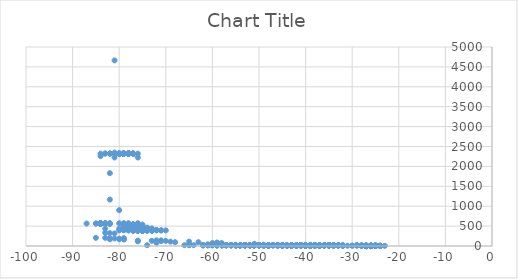
| Category | Series 0 |
|---|---|
| -27.0 | 0 |
| -27.0 | 0 |
| -27.0 | 0 |
| -27.0 | 0 |
| -27.0 | 0 |
| -27.0 | 0 |
| -27.0 | 0 |
| -27.0 | 0 |
| -27.0 | 0 |
| -27.0 | 0 |
| -27.0 | 0 |
| -27.0 | 0 |
| -27.0 | 0 |
| -27.0 | 0 |
| -27.0 | 0 |
| -27.0 | 0 |
| -27.0 | 0 |
| -27.0 | 0 |
| -27.0 | 0 |
| -27.0 | 0 |
| -27.0 | 0 |
| -27.0 | 0 |
| -27.0 | 0 |
| -27.0 | 0 |
| -27.0 | 0 |
| -27.0 | 0 |
| -27.0 | 0 |
| -27.0 | 0 |
| -27.0 | 0 |
| -27.0 | 0 |
| -27.0 | 0 |
| -27.0 | 0 |
| -27.0 | 0 |
| -27.0 | 0 |
| -27.0 | 0 |
| -27.0 | 0 |
| -27.0 | 0 |
| -27.0 | 0 |
| -27.0 | 0 |
| -27.0 | 0 |
| -27.0 | 0 |
| -27.0 | 0 |
| -27.0 | 0 |
| -27.0 | 0 |
| -27.0 | 0 |
| -27.0 | 0 |
| -27.0 | 0 |
| -27.0 | 0 |
| -27.0 | 0 |
| -27.0 | 0 |
| -27.0 | 0 |
| -27.0 | 0 |
| -27.0 | 0 |
| -27.0 | 0 |
| -27.0 | 0 |
| -27.0 | 0 |
| -26.0 | 0 |
| -26.0 | 0 |
| -26.0 | 0 |
| -26.0 | 0 |
| -26.0 | 0 |
| -26.0 | 0 |
| -26.0 | 0 |
| -26.0 | 0 |
| -26.0 | 0 |
| -26.0 | 0 |
| -26.0 | 0 |
| -26.0 | 0 |
| -26.0 | 0 |
| -26.0 | 0 |
| -26.0 | 0 |
| -26.0 | 0 |
| -26.0 | 0 |
| -26.0 | 0 |
| -26.0 | 0 |
| -26.0 | 0 |
| -26.0 | 0 |
| -26.0 | 0 |
| -26.0 | 0 |
| -26.0 | 0 |
| -26.0 | 0 |
| -26.0 | 0 |
| -25.0 | 0 |
| -24.0 | 0 |
| -27.0 | 0.116 |
| -27.0 | 0.116 |
| -27.0 | 0.116 |
| -27.0 | 0.116 |
| -27.0 | 0.116 |
| -27.0 | 0.116 |
| -27.0 | 0.116 |
| -27.0 | 0.116 |
| -27.0 | 0.116 |
| -27.0 | 0.116 |
| -27.0 | 0.116 |
| -27.0 | 0.116 |
| -27.0 | 0.116 |
| -27.0 | 0.116 |
| -27.0 | 0.116 |
| -27.0 | 0.116 |
| -27.0 | 0.116 |
| -27.0 | 0.116 |
| -27.0 | 0.116 |
| -27.0 | 0.116 |
| -27.0 | 0.116 |
| -27.0 | 0.116 |
| -27.0 | 0.116 |
| -27.0 | 0.116 |
| -26.0 | 0.116 |
| -25.0 | 0.116 |
| -25.0 | 0.116 |
| -27.0 | 0.232 |
| -27.0 | 0.232 |
| -27.0 | 0.232 |
| -27.0 | 0.232 |
| -27.0 | 0.232 |
| -27.0 | 0.232 |
| -27.0 | 0.232 |
| -27.0 | 0.232 |
| -27.0 | 0.232 |
| -27.0 | 0.232 |
| -27.0 | 0.232 |
| -27.0 | 0.232 |
| -27.0 | 0.232 |
| -27.0 | 0.232 |
| -26.0 | 0.232 |
| -26.0 | 0.232 |
| -26.0 | 0.232 |
| -26.0 | 0.232 |
| -26.0 | 0.232 |
| -26.0 | 0.232 |
| -27.0 | 0.348 |
| -27.0 | 0.348 |
| -27.0 | 0.348 |
| -27.0 | 0.348 |
| -27.0 | 0.348 |
| -27.0 | 0.348 |
| -27.0 | 0.348 |
| -27.0 | 0.348 |
| -27.0 | 0.348 |
| -27.0 | 0.348 |
| -27.0 | 0.348 |
| -27.0 | 0.348 |
| -27.0 | 0.348 |
| -27.0 | 0.348 |
| -27.0 | 0.348 |
| -27.0 | 0.348 |
| -27.0 | 0.348 |
| -27.0 | 0.348 |
| -27.0 | 0.348 |
| -27.0 | 0.348 |
| -27.0 | 0.348 |
| -27.0 | 0.348 |
| -27.0 | 0.348 |
| -27.0 | 0.348 |
| -27.0 | 0.348 |
| -27.0 | 0.348 |
| -27.0 | 0.348 |
| -27.0 | 0.348 |
| -27.0 | 0.348 |
| -27.0 | 0.348 |
| -27.0 | 0.348 |
| -27.0 | 0.348 |
| -27.0 | 0.348 |
| -27.0 | 0.348 |
| -27.0 | 0.348 |
| -27.0 | 0.348 |
| -27.0 | 0.348 |
| -27.0 | 0.348 |
| -27.0 | 0.348 |
| -27.0 | 0.348 |
| -27.0 | 0.348 |
| -27.0 | 0.348 |
| -27.0 | 0.348 |
| -26.0 | 0.348 |
| -26.0 | 0.348 |
| -26.0 | 0.348 |
| -26.0 | 0.348 |
| -26.0 | 0.348 |
| -26.0 | 0.348 |
| -26.0 | 0.348 |
| -26.0 | 0.348 |
| -26.0 | 0.348 |
| -26.0 | 0.348 |
| -26.0 | 0.348 |
| -25.0 | 0.348 |
| -25.0 | 0.348 |
| -25.0 | 0.348 |
| -25.0 | 0.348 |
| -27.0 | 0.464 |
| -27.0 | 0.464 |
| -27.0 | 0.464 |
| -27.0 | 0.464 |
| -27.0 | 0.464 |
| -27.0 | 0.464 |
| -27.0 | 0.464 |
| -27.0 | 0.464 |
| -27.0 | 0.464 |
| -27.0 | 0.464 |
| -27.0 | 0.464 |
| -27.0 | 0.464 |
| -27.0 | 0.464 |
| -27.0 | 0.464 |
| -27.0 | 0.464 |
| -27.0 | 0.464 |
| -27.0 | 0.464 |
| -27.0 | 0.464 |
| -27.0 | 0.464 |
| -27.0 | 0.464 |
| -27.0 | 0.464 |
| -27.0 | 0.464 |
| -27.0 | 0.464 |
| -27.0 | 0.464 |
| -27.0 | 0.464 |
| -26.0 | 0.464 |
| -26.0 | 0.464 |
| -26.0 | 0.464 |
| -26.0 | 0.464 |
| -26.0 | 0.464 |
| -26.0 | 0.464 |
| -26.0 | 0.464 |
| -26.0 | 0.464 |
| -25.0 | 0.464 |
| -27.0 | 0.967 |
| -27.0 | 0.967 |
| -27.0 | 0.967 |
| -27.0 | 0.967 |
| -27.0 | 0.967 |
| -27.0 | 0.967 |
| -27.0 | 0.967 |
| -27.0 | 0.967 |
| -26.0 | 0.967 |
| -26.0 | 0.967 |
| -26.0 | 0.967 |
| -27.0 | 1.027 |
| -27.0 | 1.027 |
| -27.0 | 1.027 |
| -27.0 | 1.027 |
| -27.0 | 1.027 |
| -27.0 | 1.027 |
| -27.0 | 1.027 |
| -27.0 | 1.027 |
| -27.0 | 1.027 |
| -27.0 | 1.027 |
| -27.0 | 1.027 |
| -27.0 | 1.027 |
| -27.0 | 1.027 |
| -27.0 | 1.027 |
| -27.0 | 1.027 |
| -27.0 | 1.027 |
| -27.0 | 1.027 |
| -27.0 | 1.027 |
| -27.0 | 1.027 |
| -27.0 | 1.027 |
| -27.0 | 1.027 |
| -27.0 | 1.027 |
| -27.0 | 1.027 |
| -27.0 | 1.027 |
| -27.0 | 1.027 |
| -27.0 | 1.027 |
| -27.0 | 1.027 |
| -27.0 | 1.027 |
| -27.0 | 1.027 |
| -27.0 | 1.027 |
| -27.0 | 1.027 |
| -27.0 | 1.027 |
| -27.0 | 1.027 |
| -27.0 | 1.027 |
| -27.0 | 1.027 |
| -27.0 | 1.027 |
| -27.0 | 1.027 |
| -27.0 | 1.027 |
| -27.0 | 1.027 |
| -26.0 | 1.027 |
| -26.0 | 1.027 |
| -26.0 | 1.027 |
| -26.0 | 1.027 |
| -26.0 | 1.027 |
| -26.0 | 1.027 |
| -26.0 | 1.027 |
| -26.0 | 1.027 |
| -26.0 | 1.027 |
| -26.0 | 1.027 |
| -26.0 | 1.027 |
| -26.0 | 1.027 |
| -26.0 | 1.027 |
| -26.0 | 1.027 |
| -26.0 | 1.027 |
| -25.0 | 1.027 |
| -27.0 | 1.097 |
| -27.0 | 1.097 |
| -27.0 | 1.097 |
| -27.0 | 1.097 |
| -27.0 | 1.097 |
| -27.0 | 1.097 |
| -27.0 | 1.097 |
| -27.0 | 1.097 |
| -27.0 | 1.097 |
| -27.0 | 1.097 |
| -27.0 | 1.097 |
| -27.0 | 1.097 |
| -27.0 | 1.097 |
| -27.0 | 1.097 |
| -27.0 | 1.097 |
| -27.0 | 1.097 |
| -27.0 | 1.097 |
| -27.0 | 1.097 |
| -27.0 | 1.097 |
| -26.0 | 1.097 |
| -26.0 | 1.097 |
| -26.0 | 1.097 |
| -26.0 | 1.097 |
| -25.0 | 1.097 |
| -27.0 | 1.174 |
| -27.0 | 1.174 |
| -27.0 | 1.174 |
| -27.0 | 1.174 |
| -27.0 | 1.174 |
| -27.0 | 1.174 |
| -27.0 | 1.174 |
| -27.0 | 1.174 |
| -27.0 | 1.174 |
| -27.0 | 1.174 |
| -27.0 | 1.174 |
| -27.0 | 1.174 |
| -27.0 | 1.174 |
| -27.0 | 1.174 |
| -27.0 | 1.174 |
| -27.0 | 1.174 |
| -27.0 | 1.174 |
| -27.0 | 1.174 |
| -27.0 | 1.174 |
| -27.0 | 1.174 |
| -27.0 | 1.174 |
| -27.0 | 1.174 |
| -27.0 | 1.174 |
| -27.0 | 1.174 |
| -27.0 | 1.174 |
| -26.0 | 1.174 |
| -26.0 | 1.174 |
| -26.0 | 1.174 |
| -26.0 | 1.174 |
| -26.0 | 1.174 |
| -26.0 | 1.174 |
| -26.0 | 1.174 |
| -25.0 | 1.174 |
| -27.0 | 1.257 |
| -27.0 | 1.257 |
| -27.0 | 1.257 |
| -27.0 | 1.257 |
| -27.0 | 1.257 |
| -27.0 | 1.257 |
| -27.0 | 1.257 |
| -27.0 | 1.257 |
| -27.0 | 1.257 |
| -27.0 | 1.257 |
| -27.0 | 1.257 |
| -27.0 | 1.257 |
| -27.0 | 1.257 |
| -27.0 | 1.257 |
| -26.0 | 1.257 |
| -26.0 | 1.257 |
| -26.0 | 1.257 |
| -26.0 | 1.257 |
| -26.0 | 1.257 |
| -26.0 | 1.257 |
| -26.0 | 1.257 |
| -25.0 | 1.257 |
| -27.0 | 1.345 |
| -27.0 | 1.345 |
| -27.0 | 1.345 |
| -27.0 | 1.345 |
| -27.0 | 1.345 |
| -27.0 | 1.345 |
| -27.0 | 1.345 |
| -27.0 | 1.345 |
| -27.0 | 1.345 |
| -27.0 | 1.345 |
| -27.0 | 1.345 |
| -27.0 | 1.345 |
| -27.0 | 1.345 |
| -27.0 | 1.345 |
| -27.0 | 1.345 |
| -27.0 | 1.345 |
| -27.0 | 1.345 |
| -27.0 | 1.345 |
| -27.0 | 1.345 |
| -27.0 | 1.345 |
| -27.0 | 1.345 |
| -27.0 | 1.345 |
| -27.0 | 1.345 |
| -27.0 | 1.345 |
| -27.0 | 1.345 |
| -27.0 | 1.345 |
| -27.0 | 1.345 |
| -27.0 | 1.345 |
| -27.0 | 1.345 |
| -27.0 | 1.345 |
| -27.0 | 1.345 |
| -27.0 | 1.345 |
| -27.0 | 1.345 |
| -27.0 | 1.345 |
| -27.0 | 1.345 |
| -27.0 | 1.345 |
| -27.0 | 1.345 |
| -27.0 | 1.345 |
| -27.0 | 1.345 |
| -27.0 | 1.345 |
| -27.0 | 1.345 |
| -27.0 | 1.345 |
| -27.0 | 1.345 |
| -27.0 | 1.345 |
| -27.0 | 1.345 |
| -27.0 | 1.345 |
| -27.0 | 1.345 |
| -27.0 | 1.345 |
| -27.0 | 1.345 |
| -27.0 | 1.345 |
| -27.0 | 1.345 |
| -27.0 | 1.345 |
| -27.0 | 1.345 |
| -27.0 | 1.345 |
| -27.0 | 1.345 |
| -26.0 | 1.345 |
| -26.0 | 1.345 |
| -26.0 | 1.345 |
| -26.0 | 1.345 |
| -26.0 | 1.345 |
| -26.0 | 1.345 |
| -26.0 | 1.345 |
| -26.0 | 1.345 |
| -26.0 | 1.345 |
| -26.0 | 1.345 |
| -26.0 | 1.345 |
| -26.0 | 1.345 |
| -26.0 | 1.345 |
| -26.0 | 1.345 |
| -26.0 | 1.345 |
| -26.0 | 1.345 |
| -26.0 | 1.345 |
| -26.0 | 1.345 |
| -26.0 | 1.345 |
| -26.0 | 1.345 |
| -26.0 | 1.345 |
| -26.0 | 1.345 |
| -26.0 | 1.345 |
| -26.0 | 1.345 |
| -26.0 | 1.345 |
| -25.0 | 1.345 |
| -25.0 | 1.345 |
| -25.0 | 1.345 |
| -27.0 | 1.437 |
| -27.0 | 1.437 |
| -27.0 | 1.437 |
| -27.0 | 1.437 |
| -27.0 | 1.437 |
| -27.0 | 1.437 |
| -27.0 | 1.437 |
| -27.0 | 1.437 |
| -27.0 | 1.437 |
| -27.0 | 1.437 |
| -27.0 | 1.437 |
| -27.0 | 1.437 |
| -27.0 | 1.437 |
| -27.0 | 1.437 |
| -27.0 | 1.437 |
| -27.0 | 1.437 |
| -27.0 | 1.437 |
| -27.0 | 1.437 |
| -27.0 | 1.437 |
| -27.0 | 1.437 |
| -27.0 | 1.437 |
| -26.0 | 1.437 |
| -26.0 | 1.437 |
| -26.0 | 1.437 |
| -26.0 | 1.437 |
| -26.0 | 1.437 |
| -26.0 | 1.437 |
| -26.0 | 1.437 |
| -26.0 | 1.437 |
| -26.0 | 1.437 |
| -26.0 | 1.437 |
| -26.0 | 1.437 |
| -26.0 | 1.437 |
| -26.0 | 1.437 |
| -25.0 | 1.437 |
| -27.0 | 1.532 |
| -27.0 | 1.532 |
| -27.0 | 2.123 |
| -27.0 | 2.123 |
| -27.0 | 2.123 |
| -27.0 | 2.123 |
| -27.0 | 2.123 |
| -27.0 | 2.123 |
| -27.0 | 2.123 |
| -27.0 | 2.123 |
| -27.0 | 2.123 |
| -27.0 | 2.123 |
| -27.0 | 2.123 |
| -26.0 | 2.123 |
| -26.0 | 2.123 |
| -26.0 | 2.123 |
| -26.0 | 2.123 |
| -26.0 | 2.123 |
| -26.0 | 2.123 |
| -27.0 | 2.194 |
| -27.0 | 2.194 |
| -27.0 | 2.194 |
| -27.0 | 2.194 |
| -27.0 | 2.194 |
| -27.0 | 2.194 |
| -27.0 | 2.194 |
| -27.0 | 2.194 |
| -27.0 | 2.194 |
| -27.0 | 2.194 |
| -27.0 | 2.194 |
| -27.0 | 2.194 |
| -27.0 | 2.194 |
| -27.0 | 2.194 |
| -26.0 | 2.194 |
| -26.0 | 2.194 |
| -25.0 | 2.194 |
| -24.0 | 2.194 |
| -27.0 | 2.269 |
| -27.0 | 2.269 |
| -26.0 | 2.269 |
| -26.0 | 2.269 |
| -26.0 | 2.269 |
| -26.0 | 2.269 |
| -26.0 | 2.269 |
| -26.0 | 2.269 |
| -25.0 | 2.269 |
| -27.0 | 2.348 |
| -27.0 | 2.348 |
| -27.0 | 2.348 |
| -27.0 | 2.348 |
| -27.0 | 2.348 |
| -27.0 | 2.348 |
| -27.0 | 2.348 |
| -27.0 | 2.348 |
| -26.0 | 2.348 |
| -26.0 | 2.348 |
| -26.0 | 2.348 |
| -27.0 | 2.429 |
| -27.0 | 2.429 |
| -27.0 | 2.429 |
| -27.0 | 2.429 |
| -27.0 | 2.429 |
| -27.0 | 2.429 |
| -27.0 | 2.429 |
| -27.0 | 2.429 |
| -26.0 | 2.429 |
| -26.0 | 2.429 |
| -26.0 | 2.429 |
| -27.0 | 2.514 |
| -27.0 | 2.514 |
| -27.0 | 2.514 |
| -27.0 | 2.514 |
| -27.0 | 2.514 |
| -26.0 | 2.514 |
| -26.0 | 2.514 |
| -26.0 | 2.514 |
| -26.0 | 2.514 |
| -25.0 | 2.514 |
| -27.0 | 2.601 |
| -27.0 | 2.601 |
| -27.0 | 2.601 |
| -27.0 | 2.601 |
| -27.0 | 2.601 |
| -27.0 | 2.601 |
| -27.0 | 2.601 |
| -27.0 | 2.601 |
| -26.0 | 2.601 |
| -26.0 | 2.601 |
| -26.0 | 2.601 |
| -27.0 | 2.69 |
| -27.0 | 2.69 |
| -27.0 | 2.69 |
| -27.0 | 2.69 |
| -27.0 | 2.69 |
| -27.0 | 2.69 |
| -27.0 | 2.69 |
| -27.0 | 2.69 |
| -27.0 | 2.69 |
| -26.0 | 2.69 |
| -26.0 | 2.69 |
| -26.0 | 2.69 |
| -25.0 | 2.69 |
| -27.0 | 2.78 |
| -27.0 | 2.78 |
| -27.0 | 2.78 |
| -27.0 | 2.78 |
| -27.0 | 2.78 |
| -27.0 | 2.78 |
| -27.0 | 2.78 |
| -26.0 | 2.78 |
| -26.0 | 2.78 |
| -26.0 | 2.78 |
| -27.0 | 2.873 |
| -27.0 | 2.873 |
| -27.0 | 2.873 |
| -27.0 | 2.873 |
| -27.0 | 2.873 |
| -27.0 | 2.873 |
| -27.0 | 2.873 |
| -27.0 | 2.873 |
| -26.0 | 2.873 |
| -26.0 | 2.873 |
| -25.0 | 2.873 |
| -27.0 | 2.967 |
| -27.0 | 2.967 |
| -27.0 | 2.967 |
| -27.0 | 2.967 |
| -27.0 | 2.967 |
| -27.0 | 2.967 |
| -27.0 | 2.967 |
| -27.0 | 2.967 |
| -27.0 | 2.967 |
| -27.0 | 2.967 |
| -26.0 | 2.967 |
| -26.0 | 2.967 |
| -26.0 | 2.967 |
| -27.0 | 3.063 |
| -27.0 | 3.063 |
| -27.0 | 3.063 |
| -27.0 | 3.063 |
| -27.0 | 3.063 |
| -27.0 | 3.063 |
| -27.0 | 3.063 |
| -27.0 | 3.063 |
| -27.0 | 3.063 |
| -27.0 | 3.063 |
| -27.0 | 3.063 |
| -26.0 | 3.063 |
| -26.0 | 3.063 |
| -26.0 | 3.063 |
| -26.0 | 3.063 |
| -26.0 | 3.063 |
| -27.0 | 3.16 |
| -27.0 | 3.16 |
| -27.0 | 3.16 |
| -27.0 | 3.16 |
| -27.0 | 3.16 |
| -27.0 | 3.16 |
| -27.0 | 3.16 |
| -27.0 | 3.16 |
| -27.0 | 3.16 |
| -26.0 | 3.16 |
| -26.0 | 3.16 |
| -26.0 | 3.16 |
| -26.0 | 3.16 |
| -26.0 | 3.16 |
| -27.0 | 3.259 |
| -27.0 | 3.259 |
| -26.0 | 3.259 |
| -26.0 | 3.259 |
| -27.0 | 3.78 |
| -27.0 | 3.857 |
| -27.0 | 3.857 |
| -27.0 | 3.877 |
| -26.0 | 3.877 |
| -45.0 | 4.03 |
| -37.0 | 4.03 |
| -25.0 | 4.034 |
| -27.0 | 4.125 |
| -27.0 | 4.125 |
| -24.0 | 4.217 |
| -43.0 | 4.257 |
| -27.0 | 4.404 |
| -39.0 | 4.485 |
| -39.0 | 4.485 |
| -27.0 | 4.499 |
| -27.0 | 4.499 |
| -41.0 | 4.504 |
| -38.0 | 4.504 |
| -27.0 | 4.577 |
| -44.0 | 4.599 |
| -37.0 | 4.599 |
| -27.0 | 4.69 |
| -27.0 | 4.69 |
| -27.0 | 4.69 |
| -40.0 | 4.712 |
| -39.0 | 4.712 |
| -42.0 | 4.72 |
| -39.0 | 4.784 |
| -40.0 | 4.788 |
| -26.0 | 4.788 |
| -27.0 | 4.808 |
| -27.0 | 4.808 |
| -27.0 | 4.808 |
| -26.0 | 4.808 |
| -26.0 | 4.808 |
| -26.0 | 4.808 |
| -26.0 | 4.808 |
| -23.0 | 4.808 |
| -39.0 | 4.826 |
| -37.0 | 4.828 |
| -35.0 | 4.828 |
| -27.0 | 4.837 |
| -27.0 | 4.837 |
| -27.0 | 4.837 |
| -27.0 | 4.837 |
| -27.0 | 4.837 |
| -27.0 | 4.837 |
| -27.0 | 4.837 |
| -27.0 | 4.837 |
| -27.0 | 4.837 |
| -27.0 | 4.837 |
| -27.0 | 4.837 |
| -27.0 | 4.837 |
| -27.0 | 4.837 |
| -27.0 | 4.837 |
| -27.0 | 4.837 |
| -27.0 | 4.837 |
| -27.0 | 4.837 |
| -27.0 | 4.837 |
| -27.0 | 4.837 |
| -27.0 | 4.837 |
| -27.0 | 4.837 |
| -27.0 | 4.837 |
| -27.0 | 4.837 |
| -27.0 | 4.837 |
| -27.0 | 4.837 |
| -27.0 | 4.837 |
| -27.0 | 4.837 |
| -27.0 | 4.837 |
| -27.0 | 4.837 |
| -27.0 | 4.837 |
| -27.0 | 4.837 |
| -27.0 | 4.837 |
| -27.0 | 4.837 |
| -27.0 | 4.837 |
| -27.0 | 4.837 |
| -27.0 | 4.837 |
| -27.0 | 4.837 |
| -27.0 | 4.837 |
| -27.0 | 4.837 |
| -27.0 | 4.837 |
| -27.0 | 4.837 |
| -27.0 | 4.837 |
| -27.0 | 4.837 |
| -27.0 | 4.837 |
| -27.0 | 4.837 |
| -27.0 | 4.837 |
| -27.0 | 4.837 |
| -27.0 | 4.837 |
| -27.0 | 4.837 |
| -27.0 | 4.837 |
| -27.0 | 4.837 |
| -27.0 | 4.837 |
| -27.0 | 4.837 |
| -27.0 | 4.837 |
| -27.0 | 4.837 |
| -27.0 | 4.837 |
| -27.0 | 4.837 |
| -27.0 | 4.837 |
| -27.0 | 4.837 |
| -27.0 | 4.837 |
| -27.0 | 4.837 |
| -27.0 | 4.837 |
| -27.0 | 4.837 |
| -27.0 | 4.837 |
| -26.0 | 4.837 |
| -26.0 | 4.837 |
| -26.0 | 4.837 |
| -26.0 | 4.837 |
| -26.0 | 4.837 |
| -26.0 | 4.837 |
| -26.0 | 4.837 |
| -26.0 | 4.837 |
| -26.0 | 4.837 |
| -26.0 | 4.837 |
| -26.0 | 4.837 |
| -26.0 | 4.837 |
| -26.0 | 4.837 |
| -26.0 | 4.837 |
| -26.0 | 4.837 |
| -26.0 | 4.837 |
| -26.0 | 4.837 |
| -26.0 | 4.837 |
| -26.0 | 4.837 |
| -26.0 | 4.837 |
| -26.0 | 4.837 |
| -26.0 | 4.837 |
| -26.0 | 4.837 |
| -26.0 | 4.837 |
| -26.0 | 4.837 |
| -26.0 | 4.837 |
| -26.0 | 4.837 |
| -26.0 | 4.837 |
| -26.0 | 4.837 |
| -26.0 | 4.837 |
| -26.0 | 4.837 |
| -26.0 | 4.837 |
| -26.0 | 4.837 |
| -26.0 | 4.837 |
| -26.0 | 4.837 |
| -26.0 | 4.837 |
| -26.0 | 4.837 |
| -26.0 | 4.837 |
| -26.0 | 4.837 |
| -26.0 | 4.837 |
| -26.0 | 4.837 |
| -26.0 | 4.837 |
| -26.0 | 4.837 |
| -26.0 | 4.837 |
| -26.0 | 4.837 |
| -26.0 | 4.837 |
| -26.0 | 4.837 |
| -26.0 | 4.837 |
| -25.0 | 4.837 |
| -25.0 | 4.837 |
| -39.0 | 4.867 |
| -26.0 | 4.887 |
| -26.0 | 4.887 |
| -25.0 | 4.903 |
| -39.0 | 4.941 |
| -39.0 | 4.941 |
| -27.0 | 4.986 |
| -27.0 | 4.993 |
| -26.0 | 4.993 |
| -38.0 | 5.045 |
| -37.0 | 5.055 |
| -48.0 | 5.055 |
| -40.0 | 5.055 |
| -39.0 | 5.087 |
| -27.0 | 5.087 |
| -26.0 | 5.17 |
| -26.0 | 5.17 |
| -26.0 | 5.203 |
| -32.0 | 5.21 |
| -32.0 | 5.21 |
| -26.0 | 5.284 |
| -27.0 | 5.288 |
| -27.0 | 5.288 |
| -26.0 | 5.288 |
| -26.0 | 5.309 |
| -24.0 | 5.309 |
| -27.0 | 5.331 |
| -27.0 | 5.331 |
| -26.0 | 5.331 |
| -39.0 | 5.39 |
| -38.0 | 5.39 |
| -26.0 | 5.398 |
| -25.0 | 5.398 |
| -27.0 | 5.416 |
| -27.0 | 5.416 |
| -24.0 | 5.563 |
| -25.0 | 5.741 |
| -27.0 | 5.745 |
| -26.0 | 5.745 |
| -27.0 | 5.839 |
| -48.0 | 5.845 |
| -27.0 | 5.857 |
| -27.0 | 5.857 |
| -27.0 | 5.857 |
| -26.0 | 5.857 |
| -27.0 | 5.934 |
| -27.0 | 5.934 |
| -27.0 | 5.934 |
| -26.0 | 5.934 |
| -27.0 | 5.971 |
| -27.0 | 5.971 |
| -26.0 | 5.971 |
| -26.0 | 5.971 |
| -26.0 | 5.971 |
| -26.0 | 5.971 |
| -26.0 | 5.971 |
| -27.0 | 6.029 |
| -27.0 | 6.029 |
| -27.0 | 6.029 |
| -26.0 | 6.029 |
| -26.0 | 6.029 |
| -26.0 | 6.086 |
| -26.0 | 6.086 |
| -26.0 | 6.086 |
| -44.0 | 6.086 |
| -34.0 | 6.086 |
| -27.0 | 6.126 |
| -27.0 | 6.126 |
| -27.0 | 6.126 |
| -27.0 | 6.126 |
| -26.0 | 6.126 |
| -26.0 | 6.126 |
| -26.0 | 6.126 |
| -27.0 | 6.223 |
| -27.0 | 6.223 |
| -26.0 | 6.223 |
| -26.0 | 6.223 |
| -26.0 | 6.223 |
| -26.0 | 6.223 |
| -26.0 | 6.223 |
| -27.0 | 6.261 |
| -27.0 | 6.261 |
| -27.0 | 6.32 |
| -27.0 | 6.32 |
| -27.0 | 6.32 |
| -27.0 | 6.32 |
| -26.0 | 6.32 |
| -26.0 | 6.32 |
| -26.0 | 6.32 |
| -27.0 | 6.34 |
| -26.0 | 6.373 |
| -27.0 | 6.374 |
| -27.0 | 6.417 |
| -27.0 | 6.417 |
| -27.0 | 6.417 |
| -27.0 | 6.417 |
| -27.0 | 6.417 |
| -27.0 | 6.417 |
| -27.0 | 6.417 |
| -27.0 | 6.417 |
| -26.0 | 6.417 |
| -26.0 | 6.417 |
| -26.0 | 6.417 |
| -26.0 | 6.417 |
| -26.0 | 6.417 |
| -26.0 | 6.417 |
| -27.0 | 6.484 |
| -26.0 | 6.484 |
| -26.0 | 6.484 |
| -24.0 | 6.484 |
| -27.0 | 6.511 |
| -27.0 | 6.516 |
| -27.0 | 6.516 |
| -27.0 | 6.516 |
| -27.0 | 6.516 |
| -27.0 | 6.516 |
| -27.0 | 6.516 |
| -27.0 | 6.516 |
| -27.0 | 6.516 |
| -27.0 | 6.516 |
| -27.0 | 6.516 |
| -27.0 | 6.516 |
| -27.0 | 6.516 |
| -26.0 | 6.516 |
| -26.0 | 6.516 |
| -26.0 | 6.516 |
| -26.0 | 6.516 |
| -26.0 | 6.516 |
| -26.0 | 6.516 |
| -26.0 | 6.516 |
| -25.0 | 6.516 |
| -27.0 | 6.596 |
| -26.0 | 6.596 |
| -27.0 | 6.616 |
| -27.0 | 6.616 |
| -27.0 | 6.616 |
| -27.0 | 6.616 |
| -27.0 | 6.616 |
| -27.0 | 6.616 |
| -27.0 | 6.616 |
| -27.0 | 6.616 |
| -27.0 | 6.616 |
| -27.0 | 6.616 |
| -27.0 | 6.616 |
| -26.0 | 6.616 |
| -26.0 | 6.616 |
| -26.0 | 6.616 |
| -26.0 | 6.616 |
| -26.0 | 6.616 |
| -26.0 | 6.616 |
| -26.0 | 6.616 |
| -26.0 | 6.616 |
| -26.0 | 6.616 |
| -26.0 | 6.616 |
| -27.0 | 6.716 |
| -27.0 | 6.716 |
| -27.0 | 6.716 |
| -27.0 | 6.716 |
| -27.0 | 6.716 |
| -27.0 | 6.716 |
| -27.0 | 6.716 |
| -27.0 | 6.716 |
| -27.0 | 6.716 |
| -27.0 | 6.716 |
| -26.0 | 6.716 |
| -26.0 | 6.716 |
| -26.0 | 6.716 |
| -26.0 | 6.716 |
| -26.0 | 6.716 |
| -26.0 | 6.716 |
| -31.0 | 6.718 |
| -27.0 | 6.718 |
| -27.0 | 6.815 |
| -27.0 | 6.815 |
| -27.0 | 6.815 |
| -27.0 | 6.815 |
| -27.0 | 6.815 |
| -27.0 | 6.815 |
| -27.0 | 6.815 |
| -27.0 | 6.815 |
| -27.0 | 6.815 |
| -27.0 | 6.815 |
| -27.0 | 6.815 |
| -27.0 | 6.864 |
| -27.0 | 6.864 |
| -27.0 | 6.864 |
| -26.0 | 6.864 |
| -26.0 | 6.864 |
| -26.0 | 6.864 |
| -26.0 | 6.864 |
| -25.0 | 6.864 |
| -27.0 | 6.916 |
| -27.0 | 6.916 |
| -27.0 | 6.916 |
| -27.0 | 6.916 |
| -27.0 | 6.916 |
| -27.0 | 6.916 |
| -27.0 | 6.916 |
| -27.0 | 6.916 |
| -27.0 | 6.916 |
| -27.0 | 6.916 |
| -27.0 | 6.916 |
| -27.0 | 6.916 |
| -27.0 | 6.916 |
| -27.0 | 6.916 |
| -27.0 | 6.916 |
| -27.0 | 6.916 |
| -27.0 | 6.916 |
| -27.0 | 6.916 |
| -27.0 | 6.916 |
| -27.0 | 6.916 |
| -27.0 | 6.916 |
| -26.0 | 6.916 |
| -26.0 | 6.916 |
| -26.0 | 6.916 |
| -26.0 | 6.916 |
| -26.0 | 6.916 |
| -26.0 | 6.916 |
| -26.0 | 6.916 |
| -26.0 | 6.916 |
| -26.0 | 6.916 |
| -26.0 | 6.916 |
| -26.0 | 6.916 |
| -26.0 | 6.916 |
| -26.0 | 6.916 |
| -26.0 | 6.916 |
| -26.0 | 6.916 |
| -26.0 | 6.916 |
| -26.0 | 6.916 |
| -26.0 | 6.916 |
| -26.0 | 6.916 |
| -25.0 | 6.916 |
| -25.0 | 6.916 |
| -27.0 | 6.971 |
| -26.0 | 6.971 |
| -25.0 | 6.971 |
| -32.0 | 6.985 |
| -28.0 | 6.985 |
| -28.0 | 7.018 |
| -27.0 | 7.018 |
| -27.0 | 7.018 |
| -27.0 | 7.018 |
| -27.0 | 7.018 |
| -27.0 | 7.018 |
| -27.0 | 7.018 |
| -27.0 | 7.018 |
| -27.0 | 7.018 |
| -27.0 | 7.018 |
| -27.0 | 7.018 |
| -27.0 | 7.018 |
| -27.0 | 7.018 |
| -27.0 | 7.018 |
| -27.0 | 7.018 |
| -27.0 | 7.018 |
| -27.0 | 7.018 |
| -26.0 | 7.018 |
| -26.0 | 7.018 |
| -26.0 | 7.018 |
| -26.0 | 7.018 |
| -26.0 | 7.018 |
| -26.0 | 7.018 |
| -26.0 | 7.018 |
| -26.0 | 7.018 |
| -26.0 | 7.018 |
| -26.0 | 7.018 |
| -26.0 | 7.018 |
| -26.0 | 7.018 |
| -26.0 | 7.018 |
| -26.0 | 7.018 |
| -26.0 | 7.018 |
| -26.0 | 7.018 |
| -26.0 | 7.018 |
| -26.0 | 7.018 |
| -26.0 | 7.018 |
| -25.0 | 7.018 |
| -25.0 | 7.018 |
| -27.0 | 7.079 |
| -27.0 | 7.079 |
| -27.0 | 7.119 |
| -27.0 | 7.119 |
| -27.0 | 7.119 |
| -27.0 | 7.119 |
| -27.0 | 7.119 |
| -27.0 | 7.119 |
| -27.0 | 7.119 |
| -27.0 | 7.119 |
| -27.0 | 7.119 |
| -27.0 | 7.119 |
| -27.0 | 7.119 |
| -27.0 | 7.119 |
| -26.0 | 7.119 |
| -26.0 | 7.119 |
| -26.0 | 7.119 |
| -26.0 | 7.119 |
| -26.0 | 7.119 |
| -26.0 | 7.119 |
| -26.0 | 7.119 |
| -26.0 | 7.119 |
| -26.0 | 7.119 |
| -26.0 | 7.119 |
| -26.0 | 7.119 |
| -26.0 | 7.119 |
| -25.0 | 7.119 |
| -25.0 | 7.119 |
| -25.0 | 7.119 |
| -27.0 | 7.221 |
| -27.0 | 7.221 |
| -27.0 | 7.221 |
| -27.0 | 7.221 |
| -26.0 | 7.221 |
| -24.0 | 7.221 |
| -42.0 | 7.26 |
| -41.0 | 7.26 |
| -27.0 | 7.26 |
| -26.0 | 7.26 |
| -27.0 | 7.323 |
| -27.0 | 7.323 |
| -27.0 | 7.323 |
| -27.0 | 7.323 |
| -27.0 | 7.323 |
| -27.0 | 7.323 |
| -27.0 | 7.323 |
| -27.0 | 7.323 |
| -27.0 | 7.323 |
| -27.0 | 7.323 |
| -26.0 | 7.323 |
| -26.0 | 7.323 |
| -26.0 | 7.323 |
| -26.0 | 7.323 |
| -26.0 | 7.323 |
| -49.0 | 7.35 |
| -28.0 | 7.38 |
| -27.0 | 7.427 |
| -27.0 | 7.427 |
| -27.0 | 7.427 |
| -27.0 | 7.427 |
| -27.0 | 7.427 |
| -26.0 | 7.427 |
| -26.0 | 7.427 |
| -26.0 | 7.427 |
| -26.0 | 7.427 |
| -26.0 | 7.427 |
| -26.0 | 7.427 |
| -26.0 | 7.427 |
| -26.0 | 7.427 |
| -26.0 | 7.427 |
| -25.0 | 7.427 |
| -30.0 | 7.466 |
| -29.0 | 7.466 |
| -27.0 | 7.53 |
| -27.0 | 7.53 |
| -27.0 | 7.53 |
| -27.0 | 7.53 |
| -26.0 | 7.53 |
| -26.0 | 7.53 |
| -26.0 | 7.53 |
| -26.0 | 7.53 |
| -26.0 | 7.53 |
| -26.0 | 7.53 |
| -26.0 | 7.53 |
| -26.0 | 7.53 |
| -27.0 | 7.634 |
| -27.0 | 7.634 |
| -27.0 | 7.634 |
| -27.0 | 7.634 |
| -27.0 | 7.634 |
| -27.0 | 7.634 |
| -27.0 | 7.634 |
| -27.0 | 7.634 |
| -27.0 | 7.634 |
| -27.0 | 7.634 |
| -26.0 | 7.634 |
| -26.0 | 7.634 |
| -26.0 | 7.634 |
| -26.0 | 7.634 |
| -25.0 | 7.634 |
| -40.0 | 7.805 |
| -30.0 | 8.528 |
| -27.0 | 9.938 |
| -43.0 | 10.369 |
| -43.0 | 10.369 |
| -48.0 | 11.707 |
| -33.0 | 11.707 |
| -42.0 | 11.875 |
| -36.0 | 12.394 |
| -44.0 | 12.55 |
| -42.0 | 13.534 |
| -35.0 | 13.534 |
| -40.0 | 14.031 |
| -41.0 | 14.343 |
| -36.0 | 14.343 |
| -34.0 | 14.343 |
| -50.0 | 14.382 |
| -44.0 | 14.382 |
| -55.0 | 14.42 |
| -48.0 | 14.42 |
| -48.0 | 14.42 |
| -47.0 | 14.42 |
| -43.0 | 14.42 |
| -46.0 | 14.46 |
| -46.0 | 14.46 |
| -45.0 | 14.46 |
| -45.0 | 14.46 |
| -44.0 | 14.46 |
| -43.0 | 14.46 |
| -43.0 | 14.46 |
| -42.0 | 14.46 |
| -42.0 | 14.46 |
| -42.0 | 14.46 |
| -42.0 | 14.46 |
| -42.0 | 14.46 |
| -42.0 | 14.46 |
| -41.0 | 14.46 |
| -41.0 | 14.46 |
| -41.0 | 14.46 |
| -41.0 | 14.46 |
| -41.0 | 14.46 |
| -41.0 | 14.46 |
| -41.0 | 14.46 |
| -41.0 | 14.46 |
| -41.0 | 14.46 |
| -40.0 | 14.46 |
| -40.0 | 14.46 |
| -40.0 | 14.46 |
| -40.0 | 14.46 |
| -40.0 | 14.46 |
| -40.0 | 14.46 |
| -48.0 | 14.5 |
| -46.0 | 14.5 |
| -46.0 | 14.5 |
| -46.0 | 14.5 |
| -45.0 | 14.5 |
| -45.0 | 14.5 |
| -44.0 | 14.5 |
| -44.0 | 14.5 |
| -43.0 | 14.5 |
| -42.0 | 14.5 |
| -42.0 | 14.5 |
| -42.0 | 14.5 |
| -42.0 | 14.5 |
| -42.0 | 14.5 |
| -42.0 | 14.5 |
| -42.0 | 14.5 |
| -41.0 | 14.5 |
| -41.0 | 14.5 |
| -41.0 | 14.5 |
| -41.0 | 14.5 |
| -41.0 | 14.5 |
| -41.0 | 14.5 |
| -40.0 | 14.5 |
| -40.0 | 14.5 |
| -40.0 | 14.5 |
| -40.0 | 14.5 |
| -40.0 | 14.5 |
| -44.0 | 14.541 |
| -34.0 | 14.541 |
| -44.0 | 14.541 |
| -42.0 | 14.541 |
| -42.0 | 14.541 |
| -42.0 | 14.541 |
| -41.0 | 14.541 |
| -41.0 | 14.541 |
| -40.0 | 14.541 |
| -40.0 | 14.541 |
| -42.0 | 14.583 |
| -42.0 | 14.583 |
| -48.0 | 14.626 |
| -42.0 | 14.626 |
| -42.0 | 14.626 |
| -42.0 | 14.626 |
| -43.0 | 14.67 |
| -42.0 | 14.67 |
| -42.0 | 14.714 |
| -41.0 | 14.714 |
| -42.0 | 14.759 |
| -42.0 | 14.759 |
| -41.0 | 14.759 |
| -42.0 | 14.805 |
| -42.0 | 14.805 |
| -41.0 | 14.805 |
| -40.0 | 15.114 |
| -37.0 | 15.114 |
| -37.0 | 15.114 |
| -36.0 | 15.114 |
| -34.0 | 15.114 |
| -33.0 | 15.114 |
| -36.0 | 15.148 |
| -33.0 | 15.148 |
| -33.0 | 15.148 |
| -33.0 | 15.148 |
| -32.0 | 15.148 |
| -32.0 | 15.148 |
| -45.0 | 15.222 |
| -44.0 | 15.222 |
| -44.0 | 15.222 |
| -41.0 | 15.222 |
| -43.0 | 15.587 |
| -42.0 | 15.587 |
| -42.0 | 15.587 |
| -42.0 | 15.587 |
| -43.0 | 15.631 |
| -43.0 | 15.631 |
| -42.0 | 15.631 |
| -42.0 | 15.631 |
| -42.0 | 15.631 |
| -42.0 | 15.631 |
| -42.0 | 15.631 |
| -41.0 | 15.631 |
| -41.0 | 15.676 |
| -40.0 | 15.676 |
| -40.0 | 15.722 |
| -42.0 | 15.768 |
| -42.0 | 15.768 |
| -42.0 | 15.815 |
| -42.0 | 15.912 |
| -41.0 | 15.962 |
| -41.0 | 15.962 |
| -41.0 | 16.011 |
| -44.0 | 16.062 |
| -42.0 | 16.062 |
| -35.0 | 16.21 |
| -35.0 | 16.239 |
| -35.0 | 16.239 |
| -35.0 | 16.269 |
| -35.0 | 16.3 |
| -38.0 | 16.332 |
| -36.0 | 16.332 |
| -35.0 | 16.332 |
| -35.0 | 16.332 |
| -36.0 | 16.364 |
| -35.0 | 16.364 |
| -44.0 | 16.467 |
| -42.0 | 16.467 |
| -46.0 | 16.575 |
| -41.0 | 16.69 |
| -35.0 | 17.032 |
| -35.0 | 17.06 |
| -35.0 | 17.06 |
| -35.0 | 17.06 |
| -40.0 | 17.12 |
| -40.0 | 17.12 |
| -37.0 | 17.12 |
| -39.0 | 17.213 |
| -39.0 | 17.213 |
| -42.0 | 17.261 |
| -39.0 | 17.261 |
| -39.0 | 17.261 |
| -37.0 | 17.261 |
| -43.0 | 17.31 |
| -43.0 | 17.31 |
| -42.0 | 17.31 |
| -41.0 | 17.31 |
| -41.0 | 17.31 |
| -40.0 | 17.31 |
| -45.0 | 17.359 |
| -43.0 | 17.359 |
| -44.0 | 17.46 |
| -47.0 | 17.491 |
| -45.0 | 17.491 |
| -50.0 | 17.567 |
| -35.0 | 17.782 |
| -35.0 | 17.806 |
| -35.0 | 17.806 |
| -35.0 | 17.806 |
| -42.0 | 17.901 |
| -38.0 | 17.901 |
| -37.0 | 17.901 |
| -36.0 | 17.901 |
| -35.0 | 17.901 |
| -39.0 | 17.945 |
| -38.0 | 17.945 |
| -37.0 | 17.945 |
| -37.0 | 17.945 |
| -37.0 | 17.945 |
| -37.0 | 17.945 |
| -37.0 | 17.945 |
| -35.0 | 17.945 |
| -38.0 | 18.083 |
| -38.0 | 18.083 |
| -36.0 | 18.083 |
| -38.0 | 18.13 |
| -38.0 | 18.13 |
| -38.0 | 18.13 |
| -35.0 | 18.13 |
| -38.0 | 18.178 |
| -37.0 | 18.178 |
| -35.0 | 18.178 |
| -35.0 | 18.178 |
| -33.0 | 18.178 |
| -33.0 | 18.178 |
| -36.0 | 18.226 |
| -37.0 | 18.275 |
| -35.0 | 18.275 |
| -34.0 | 18.275 |
| -52.0 | 18.287 |
| -52.0 | 18.287 |
| -51.0 | 18.287 |
| -53.0 | 18.324 |
| -52.0 | 18.324 |
| -51.0 | 18.324 |
| -50.0 | 18.324 |
| -49.0 | 18.324 |
| -49.0 | 18.324 |
| -49.0 | 18.324 |
| -49.0 | 18.324 |
| -48.0 | 18.324 |
| -53.0 | 18.374 |
| -50.0 | 18.425 |
| -49.0 | 18.425 |
| -49.0 | 18.425 |
| -53.0 | 18.477 |
| -53.0 | 18.477 |
| -52.0 | 18.477 |
| -52.0 | 18.477 |
| -52.0 | 18.477 |
| -51.0 | 18.477 |
| -51.0 | 18.477 |
| -51.0 | 18.477 |
| -49.0 | 18.477 |
| -49.0 | 18.477 |
| -51.0 | 18.483 |
| -35.0 | 18.526 |
| -35.0 | 18.526 |
| -35.0 | 18.526 |
| -35.0 | 18.526 |
| -35.0 | 18.526 |
| -53.0 | 18.529 |
| -52.0 | 18.529 |
| -52.0 | 18.529 |
| -51.0 | 18.529 |
| -51.0 | 18.529 |
| -49.0 | 18.529 |
| -35.0 | 18.547 |
| -35.0 | 18.547 |
| -35.0 | 18.547 |
| -35.0 | 18.568 |
| -35.0 | 18.568 |
| -35.0 | 18.568 |
| -35.0 | 18.568 |
| -58.0 | 18.581 |
| -57.0 | 18.581 |
| -56.0 | 18.581 |
| -56.0 | 18.581 |
| -56.0 | 18.581 |
| -55.0 | 18.581 |
| -55.0 | 18.581 |
| -55.0 | 18.581 |
| -55.0 | 18.581 |
| -55.0 | 18.581 |
| -55.0 | 18.581 |
| -55.0 | 18.581 |
| -55.0 | 18.581 |
| -54.0 | 18.581 |
| -54.0 | 18.581 |
| -54.0 | 18.581 |
| -54.0 | 18.581 |
| -54.0 | 18.581 |
| -54.0 | 18.581 |
| -54.0 | 18.581 |
| -54.0 | 18.581 |
| -54.0 | 18.581 |
| -54.0 | 18.581 |
| -54.0 | 18.581 |
| -54.0 | 18.581 |
| -54.0 | 18.581 |
| -54.0 | 18.581 |
| -54.0 | 18.581 |
| -54.0 | 18.581 |
| -53.0 | 18.581 |
| -53.0 | 18.581 |
| -53.0 | 18.581 |
| -53.0 | 18.581 |
| -53.0 | 18.581 |
| -53.0 | 18.581 |
| -53.0 | 18.581 |
| -53.0 | 18.581 |
| -53.0 | 18.581 |
| -53.0 | 18.581 |
| -53.0 | 18.581 |
| -53.0 | 18.581 |
| -53.0 | 18.581 |
| -53.0 | 18.581 |
| -53.0 | 18.581 |
| -53.0 | 18.581 |
| -53.0 | 18.581 |
| -53.0 | 18.581 |
| -53.0 | 18.581 |
| -53.0 | 18.581 |
| -53.0 | 18.581 |
| -53.0 | 18.581 |
| -53.0 | 18.581 |
| -53.0 | 18.581 |
| -52.0 | 18.581 |
| -52.0 | 18.581 |
| -52.0 | 18.581 |
| -52.0 | 18.581 |
| -52.0 | 18.581 |
| -52.0 | 18.581 |
| -52.0 | 18.581 |
| -51.0 | 18.581 |
| -51.0 | 18.581 |
| -51.0 | 18.581 |
| -51.0 | 18.581 |
| -51.0 | 18.581 |
| -51.0 | 18.581 |
| -50.0 | 18.581 |
| -50.0 | 18.581 |
| -50.0 | 18.581 |
| -50.0 | 18.581 |
| -50.0 | 18.581 |
| -50.0 | 18.581 |
| -50.0 | 18.581 |
| -50.0 | 18.581 |
| -35.0 | 18.59 |
| -50.0 | 18.604 |
| -49.0 | 18.604 |
| -36.0 | 18.604 |
| -35.0 | 18.613 |
| -35.0 | 18.613 |
| -52.0 | 18.633 |
| -53.0 | 18.741 |
| -53.0 | 18.741 |
| -49.0 | 18.741 |
| -41.0 | 18.791 |
| -38.0 | 18.791 |
| -58.0 | 18.796 |
| -55.0 | 18.796 |
| -52.0 | 18.796 |
| -51.0 | 18.796 |
| -50.0 | 18.796 |
| -50.0 | 18.796 |
| -54.0 | 18.852 |
| -53.0 | 18.852 |
| -51.0 | 18.852 |
| -53.0 | 18.908 |
| -52.0 | 18.908 |
| -60.0 | 18.964 |
| -57.0 | 18.964 |
| -56.0 | 18.964 |
| -56.0 | 18.964 |
| -54.0 | 18.964 |
| -54.0 | 18.964 |
| -54.0 | 18.964 |
| -51.0 | 18.964 |
| -51.0 | 18.964 |
| -49.0 | 18.964 |
| -55.0 | 18.999 |
| -54.0 | 18.999 |
| -52.0 | 18.999 |
| -45.0 | 19.002 |
| -45.0 | 19.002 |
| -41.0 | 19.002 |
| -62.0 | 19.02 |
| -61.0 | 19.02 |
| -60.0 | 19.02 |
| -59.0 | 19.02 |
| -59.0 | 19.02 |
| -59.0 | 19.02 |
| -59.0 | 19.02 |
| -58.0 | 19.02 |
| -55.0 | 19.02 |
| -54.0 | 19.02 |
| -54.0 | 19.02 |
| -54.0 | 19.02 |
| -54.0 | 19.02 |
| -54.0 | 19.02 |
| -53.0 | 19.02 |
| -53.0 | 19.02 |
| -52.0 | 19.02 |
| -52.0 | 19.02 |
| -51.0 | 19.02 |
| -50.0 | 19.02 |
| -55.0 | 19.046 |
| -55.0 | 19.046 |
| -54.0 | 19.046 |
| -54.0 | 19.046 |
| -53.0 | 19.046 |
| -53.0 | 19.046 |
| -53.0 | 19.046 |
| -53.0 | 19.046 |
| -53.0 | 19.046 |
| -53.0 | 19.046 |
| -53.0 | 19.046 |
| -53.0 | 19.046 |
| -53.0 | 19.046 |
| -50.0 | 19.046 |
| -49.0 | 19.046 |
| -48.0 | 19.046 |
| -54.0 | 19.094 |
| -54.0 | 19.094 |
| -53.0 | 19.094 |
| -53.0 | 19.094 |
| -53.0 | 19.094 |
| -53.0 | 19.094 |
| -53.0 | 19.094 |
| -53.0 | 19.094 |
| -53.0 | 19.094 |
| -53.0 | 19.094 |
| -53.0 | 19.094 |
| -53.0 | 19.094 |
| -53.0 | 19.094 |
| -53.0 | 19.094 |
| -53.0 | 19.094 |
| -53.0 | 19.094 |
| -53.0 | 19.094 |
| -53.0 | 19.094 |
| -53.0 | 19.094 |
| -53.0 | 19.094 |
| -52.0 | 19.094 |
| -52.0 | 19.094 |
| -51.0 | 19.094 |
| -51.0 | 19.094 |
| -50.0 | 19.094 |
| -50.0 | 19.094 |
| -49.0 | 19.094 |
| -49.0 | 19.094 |
| -55.0 | 19.142 |
| -54.0 | 19.142 |
| -54.0 | 19.142 |
| -54.0 | 19.142 |
| -54.0 | 19.142 |
| -54.0 | 19.142 |
| -54.0 | 19.142 |
| -54.0 | 19.142 |
| -53.0 | 19.142 |
| -53.0 | 19.142 |
| -53.0 | 19.142 |
| -53.0 | 19.142 |
| -53.0 | 19.142 |
| -53.0 | 19.142 |
| -53.0 | 19.142 |
| -53.0 | 19.142 |
| -53.0 | 19.142 |
| -53.0 | 19.142 |
| -53.0 | 19.142 |
| -53.0 | 19.142 |
| -53.0 | 19.142 |
| -53.0 | 19.142 |
| -53.0 | 19.142 |
| -53.0 | 19.142 |
| -53.0 | 19.142 |
| -53.0 | 19.142 |
| -53.0 | 19.142 |
| -53.0 | 19.142 |
| -53.0 | 19.142 |
| -53.0 | 19.142 |
| -52.0 | 19.142 |
| -52.0 | 19.142 |
| -52.0 | 19.142 |
| -51.0 | 19.142 |
| -51.0 | 19.142 |
| -51.0 | 19.142 |
| -51.0 | 19.142 |
| -50.0 | 19.142 |
| -49.0 | 19.142 |
| -42.0 | 19.157 |
| -39.0 | 19.157 |
| -34.0 | 19.167 |
| -35.0 | 19.362 |
| -35.0 | 19.381 |
| -45.0 | 19.423 |
| -53.0 | 19.479 |
| -52.0 | 19.562 |
| -49.0 | 19.562 |
| -53.0 | 19.647 |
| -49.0 | 19.69 |
| -47.0 | 19.69 |
| -49.0 | 19.734 |
| -48.0 | 19.734 |
| -47.0 | 19.734 |
| -46.0 | 19.734 |
| -74.0 | 19.763 |
| -59.0 | 19.763 |
| -56.0 | 19.763 |
| -56.0 | 19.763 |
| -56.0 | 19.763 |
| -55.0 | 19.763 |
| -52.0 | 19.763 |
| -52.0 | 19.763 |
| -51.0 | 19.763 |
| -51.0 | 19.763 |
| -50.0 | 19.763 |
| -53.0 | 19.779 |
| -53.0 | 19.779 |
| -53.0 | 19.779 |
| -53.0 | 19.779 |
| -48.0 | 19.779 |
| -48.0 | 19.779 |
| -46.0 | 19.779 |
| -66.0 | 19.818 |
| -64.0 | 19.818 |
| -62.0 | 19.818 |
| -62.0 | 19.818 |
| -62.0 | 19.818 |
| -62.0 | 19.818 |
| -61.0 | 19.818 |
| -61.0 | 19.818 |
| -61.0 | 19.818 |
| -61.0 | 19.818 |
| -60.0 | 19.818 |
| -60.0 | 19.818 |
| -59.0 | 19.818 |
| -59.0 | 19.818 |
| -58.0 | 19.818 |
| -58.0 | 19.818 |
| -58.0 | 19.818 |
| -58.0 | 19.818 |
| -58.0 | 19.818 |
| -57.0 | 19.818 |
| -57.0 | 19.818 |
| -57.0 | 19.818 |
| -57.0 | 19.818 |
| -57.0 | 19.818 |
| -57.0 | 19.818 |
| -57.0 | 19.818 |
| -57.0 | 19.818 |
| -57.0 | 19.818 |
| -55.0 | 19.818 |
| -54.0 | 19.818 |
| -52.0 | 19.824 |
| -52.0 | 19.824 |
| -51.0 | 19.824 |
| -51.0 | 19.824 |
| -51.0 | 19.824 |
| -50.0 | 19.824 |
| -50.0 | 19.824 |
| -50.0 | 19.824 |
| -49.0 | 19.824 |
| -49.0 | 19.824 |
| -49.0 | 19.824 |
| -49.0 | 19.824 |
| -47.0 | 19.824 |
| -46.0 | 19.824 |
| -45.0 | 19.824 |
| -45.0 | 19.824 |
| -45.0 | 19.824 |
| -50.0 | 19.869 |
| -49.0 | 19.869 |
| -49.0 | 19.869 |
| -49.0 | 19.869 |
| -49.0 | 19.869 |
| -49.0 | 19.869 |
| -49.0 | 19.869 |
| -48.0 | 19.869 |
| -48.0 | 19.869 |
| -47.0 | 19.869 |
| -46.0 | 19.869 |
| -46.0 | 19.869 |
| -46.0 | 19.869 |
| -46.0 | 19.869 |
| -65.0 | 19.874 |
| -38.0 | 19.945 |
| -40.0 | 19.948 |
| -37.0 | 19.948 |
| -39.0 | 19.97 |
| -32.0 | 19.977 |
| -59.0 | 19.988 |
| -58.0 | 19.988 |
| -36.0 | 20.002 |
| -42.0 | 20.012 |
| -29.0 | 20.012 |
| -29.0 | 20.033 |
| -41.0 | 20.07 |
| -28.0 | 20.07 |
| -39.0 | 20.071 |
| -33.0 | 20.071 |
| -37.0 | 20.129 |
| -35.0 | 20.129 |
| -34.0 | 20.129 |
| -36.0 | 20.146 |
| -35.0 | 20.146 |
| -34.0 | 20.146 |
| -35.0 | 20.163 |
| -35.0 | 20.18 |
| -35.0 | 20.18 |
| -59.0 | 20.839 |
| -42.0 | 20.839 |
| -59.0 | 20.841 |
| -37.0 | 20.867 |
| -41.0 | 20.94 |
| -40.0 | 20.94 |
| -39.0 | 20.94 |
| -39.0 | 20.94 |
| -37.0 | 20.94 |
| -37.0 | 20.94 |
| -37.0 | 20.94 |
| -37.0 | 20.94 |
| -35.0 | 20.94 |
| -35.0 | 20.94 |
| -60.0 | 20.954 |
| -59.0 | 20.954 |
| -41.0 | 20.955 |
| -39.0 | 20.955 |
| -35.0 | 20.955 |
| -35.0 | 20.955 |
| -58.0 | 21.752 |
| -45.0 | 22.2 |
| -45.0 | 22.2 |
| -59.0 | 22.554 |
| -58.0 | 23.255 |
| -57.0 | 23.255 |
| -46.0 | 23.517 |
| -46.0 | 23.685 |
| -53.0 | 23.868 |
| -56.0 | 24.38 |
| -55.0 | 24.38 |
| -59.0 | 24.843 |
| -54.0 | 24.843 |
| -46.0 | 24.85 |
| -46.0 | 24.85 |
| -46.0 | 24.85 |
| -47.0 | 24.903 |
| -58.0 | 24.934 |
| -60.0 | 25.375 |
| -59.0 | 25.375 |
| -65.0 | 25.457 |
| -55.0 | 25.457 |
| -59.0 | 26.106 |
| -51.0 | 26.106 |
| -46.0 | 28.025 |
| -51.0 | 31.307 |
| -49.0 | 31.307 |
| -65.0 | 36.603 |
| -61.0 | 42.548 |
| -59.0 | 48.787 |
| -59.0 | 48.787 |
| -51.0 | 55.33 |
| -60.0 | 75.351 |
| -58.0 | 75.351 |
| -72.0 | 81.894 |
| -59.0 | 88.567 |
| -68.0 | 95.503 |
| -63.0 | 95.503 |
| -72.0 | 102.362 |
| -69.0 | 109.34 |
| -65.0 | 109.34 |
| -76.0 | 116.736 |
| -71.0 | 122.978 |
| -73.0 | 129.672 |
| -70.0 | 129.672 |
| -76.0 | 135.751 |
| -72.0 | 142.178 |
| -71.0 | 142.178 |
| -79.0 | 163.28 |
| -82.0 | 170.104 |
| -80.0 | 170.104 |
| -79.0 | 177.152 |
| -80.0 | 183.824 |
| -82.0 | 190.454 |
| -81.0 | 190.454 |
| -79.0 | 198.071 |
| -85.0 | 205.02 |
| -83.0 | 205.02 |
| -81.0 | 315.411 |
| -82.0 | 323.33 |
| -83.0 | 332.115 |
| -76.0 | 391.224 |
| -76.0 | 391.224 |
| -75.0 | 391.224 |
| -75.0 | 391.224 |
| -75.0 | 391.224 |
| -74.0 | 391.224 |
| -73.0 | 391.224 |
| -75.0 | 391.263 |
| -74.0 | 391.263 |
| -74.0 | 391.263 |
| -73.0 | 391.263 |
| -77.0 | 391.339 |
| -77.0 | 391.339 |
| -77.0 | 391.339 |
| -76.0 | 391.339 |
| -76.0 | 391.339 |
| -76.0 | 391.339 |
| -76.0 | 391.339 |
| -76.0 | 391.339 |
| -76.0 | 391.339 |
| -76.0 | 391.339 |
| -76.0 | 391.339 |
| -76.0 | 391.339 |
| -76.0 | 391.339 |
| -76.0 | 391.339 |
| -75.0 | 391.339 |
| -75.0 | 391.339 |
| -75.0 | 391.339 |
| -75.0 | 391.339 |
| -75.0 | 391.339 |
| -75.0 | 391.339 |
| -75.0 | 391.339 |
| -75.0 | 391.339 |
| -75.0 | 391.339 |
| -74.0 | 391.339 |
| -73.0 | 391.339 |
| -76.0 | 391.378 |
| -76.0 | 391.378 |
| -76.0 | 391.378 |
| -75.0 | 391.378 |
| -75.0 | 391.378 |
| -75.0 | 391.378 |
| -75.0 | 391.378 |
| -75.0 | 391.378 |
| -75.0 | 391.378 |
| -75.0 | 391.378 |
| -75.0 | 391.378 |
| -74.0 | 391.378 |
| -74.0 | 391.378 |
| -74.0 | 391.378 |
| -74.0 | 391.378 |
| -74.0 | 391.378 |
| -74.0 | 391.378 |
| -74.0 | 391.378 |
| -73.0 | 391.378 |
| -73.0 | 391.378 |
| -73.0 | 391.378 |
| -73.0 | 391.378 |
| -73.0 | 391.378 |
| -76.0 | 391.494 |
| -76.0 | 391.494 |
| -76.0 | 391.494 |
| -76.0 | 391.494 |
| -75.0 | 391.494 |
| -74.0 | 391.494 |
| -77.0 | 391.61 |
| -77.0 | 391.61 |
| -77.0 | 391.61 |
| -77.0 | 391.61 |
| -77.0 | 391.61 |
| -77.0 | 391.61 |
| -77.0 | 391.61 |
| -77.0 | 391.61 |
| -76.0 | 391.61 |
| -76.0 | 391.61 |
| -76.0 | 391.61 |
| -76.0 | 391.61 |
| -76.0 | 391.61 |
| -76.0 | 391.61 |
| -76.0 | 391.61 |
| -76.0 | 391.61 |
| -76.0 | 391.61 |
| -76.0 | 391.61 |
| -76.0 | 391.61 |
| -76.0 | 391.61 |
| -74.0 | 391.61 |
| -73.0 | 391.61 |
| -77.0 | 391.726 |
| -77.0 | 391.726 |
| -76.0 | 391.726 |
| -76.0 | 391.726 |
| -76.0 | 391.726 |
| -76.0 | 391.726 |
| -76.0 | 391.726 |
| -76.0 | 391.726 |
| -76.0 | 391.726 |
| -76.0 | 391.726 |
| -76.0 | 391.726 |
| -76.0 | 391.726 |
| -76.0 | 391.726 |
| -76.0 | 391.726 |
| -76.0 | 391.726 |
| -76.0 | 391.726 |
| -76.0 | 391.726 |
| -76.0 | 391.726 |
| -75.0 | 391.726 |
| -75.0 | 391.726 |
| -75.0 | 391.726 |
| -75.0 | 391.726 |
| -75.0 | 391.726 |
| -75.0 | 391.726 |
| -74.0 | 391.726 |
| -73.0 | 391.726 |
| -80.0 | 391.842 |
| -78.0 | 391.958 |
| -77.0 | 391.958 |
| -76.0 | 392.266 |
| -71.0 | 393.031 |
| -70.0 | 393.031 |
| -71.0 | 393.053 |
| -75.0 | 393.706 |
| -77.0 | 394.074 |
| -76.0 | 394.17 |
| -72.0 | 394.17 |
| -78.0 | 394.73 |
| -77.0 | 396.122 |
| -73.0 | 397.148 |
| -72.0 | 397.237 |
| -77.0 | 397.677 |
| -73.0 | 397.677 |
| -77.0 | 398.018 |
| -75.0 | 398.176 |
| -73.0 | 398.176 |
| -76.0 | 398.477 |
| -75.0 | 398.477 |
| -73.0 | 398.822 |
| -77.0 | 399.091 |
| -72.0 | 399.285 |
| -79.0 | 399.887 |
| -74.0 | 399.982 |
| -79.0 | 400.226 |
| -77.0 | 400.226 |
| -78.0 | 400.684 |
| -78.0 | 401.259 |
| -74.0 | 401.259 |
| -78.0 | 402.066 |
| -75.0 | 402.078 |
| -78.0 | 403.111 |
| -73.0 | 403.111 |
| -78.0 | 403.361 |
| -77.0 | 407.32 |
| -74.0 | 407.32 |
| -77.0 | 408.723 |
| -77.0 | 410.345 |
| -77.0 | 411.633 |
| -73.0 | 411.633 |
| -77.0 | 411.956 |
| -79.0 | 412.895 |
| -74.0 | 413.025 |
| -79.0 | 414.068 |
| -78.0 | 414.068 |
| -79.0 | 414.431 |
| -78.0 | 415.242 |
| -78.0 | 416.776 |
| -78.0 | 424.139 |
| -78.0 | 424.139 |
| -78.0 | 425.785 |
| -76.0 | 429.404 |
| -75.0 | 429.404 |
| -76.0 | 430.305 |
| -77.0 | 430.705 |
| -78.0 | 432.157 |
| -77.0 | 432.21 |
| -77.0 | 432.21 |
| -76.0 | 432.968 |
| -78.0 | 433.689 |
| -78.0 | 434.036 |
| -76.0 | 434.036 |
| -76.0 | 434.296 |
| -83.0 | 434.957 |
| -80.0 | 434.957 |
| -78.0 | 436.225 |
| -77.0 | 437.531 |
| -77.0 | 438.574 |
| -75.0 | 438.574 |
| -78.0 | 439.42 |
| -79.0 | 439.572 |
| -78.0 | 439.572 |
| -79.0 | 440.36 |
| -78.0 | 440.461 |
| -77.0 | 440.461 |
| -79.0 | 441.055 |
| -77.0 | 441.772 |
| -79.0 | 442.237 |
| -76.0 | 442.237 |
| -73.0 | 442.929 |
| -76.0 | 443.306 |
| -79.0 | 443.701 |
| -77.0 | 443.738 |
| -74.0 | 443.738 |
| -78.0 | 443.815 |
| -78.0 | 443.815 |
| -77.0 | 443.964 |
| -76.0 | 444.008 |
| -79.0 | 444.087 |
| -78.0 | 444.087 |
| -77.0 | 444.258 |
| -77.0 | 444.258 |
| -78.0 | 444.435 |
| -77.0 | 444.499 |
| -75.0 | 444.746 |
| -77.0 | 444.881 |
| -77.0 | 445.258 |
| -75.0 | 445.258 |
| -79.0 | 445.565 |
| -76.0 | 445.754 |
| -78.0 | 445.788 |
| -75.0 | 445.788 |
| -75.0 | 445.904 |
| -78.0 | 447.213 |
| -78.0 | 448.524 |
| -77.0 | 448.524 |
| -78.0 | 449.848 |
| -78.0 | 451.066 |
| -77.0 | 451.066 |
| -79.0 | 452.338 |
| -78.0 | 453.788 |
| -77.0 | 459.913 |
| -77.0 | 460.215 |
| -75.0 | 461.185 |
| -77.0 | 462.575 |
| -74.0 | 462.575 |
| -79.0 | 463.964 |
| -78.0 | 465.352 |
| -76.0 | 469.681 |
| -75.0 | 469.681 |
| -76.0 | 470.77 |
| -78.0 | 470.975 |
| -77.0 | 471.746 |
| -77.0 | 471.746 |
| -77.0 | 472.244 |
| -78.0 | 472.671 |
| -77.0 | 473.828 |
| -77.0 | 473.828 |
| -75.0 | 476.213 |
| -78.0 | 478.123 |
| -76.0 | 479.449 |
| -78.0 | 480.722 |
| -78.0 | 480.722 |
| -76.0 | 482.049 |
| -77.0 | 483.321 |
| -77.0 | 484.766 |
| -75.0 | 484.766 |
| -76.0 | 486.094 |
| -78.0 | 487.368 |
| -77.0 | 487.368 |
| -78.0 | 488.582 |
| -77.0 | 489.661 |
| -76.0 | 491.243 |
| -78.0 | 491.728 |
| -75.0 | 501.908 |
| -76.0 | 508.679 |
| -78.0 | 512.914 |
| -76.0 | 513.825 |
| -79.0 | 515.602 |
| -76.0 | 523.198 |
| -77.0 | 527.388 |
| -77.0 | 528.913 |
| -77.0 | 528.913 |
| -78.0 | 530.21 |
| -78.0 | 531.121 |
| -77.0 | 531.121 |
| -77.0 | 531.349 |
| -77.0 | 531.349 |
| -77.0 | 531.349 |
| -77.0 | 531.349 |
| -77.0 | 531.349 |
| -77.0 | 531.349 |
| -77.0 | 531.349 |
| -77.0 | 531.349 |
| -79.0 | 531.463 |
| -78.0 | 531.463 |
| -77.0 | 531.463 |
| -77.0 | 531.463 |
| -77.0 | 531.463 |
| -77.0 | 531.463 |
| -77.0 | 531.463 |
| -77.0 | 531.463 |
| -76.0 | 531.463 |
| -77.0 | 532.078 |
| -76.0 | 532.988 |
| -79.0 | 534.288 |
| -79.0 | 534.288 |
| -77.0 | 535.587 |
| -76.0 | 536.15 |
| -77.0 | 536.327 |
| -77.0 | 536.327 |
| -77.0 | 538.89 |
| -75.0 | 538.89 |
| -77.0 | 540.191 |
| -77.0 | 541.381 |
| -79.0 | 547.087 |
| -78.0 | 547.087 |
| -84.0 | 551.761 |
| -84.0 | 556.233 |
| -83.0 | 557.575 |
| -82.0 | 557.575 |
| -76.0 | 560.528 |
| -79.0 | 560.917 |
| -87.0 | 564.269 |
| -84.0 | 564.295 |
| -82.0 | 564.732 |
| -85.0 | 565.323 |
| -78.0 | 565.378 |
| -82.0 | 565.425 |
| -82.0 | 565.425 |
| -82.0 | 565.649 |
| -83.0 | 565.695 |
| -83.0 | 565.829 |
| -84.0 | 565.968 |
| -85.0 | 566.046 |
| -83.0 | 566.046 |
| -84.0 | 566.097 |
| -82.0 | 566.097 |
| -84.0 | 566.111 |
| -83.0 | 566.135 |
| -78.0 | 568.313 |
| -84.0 | 570.814 |
| -80.0 | 571.328 |
| -79.0 | 571.44 |
| -83.0 | 571.575 |
| -76.0 | 572.223 |
| -84.0 | 574.706 |
| -84.0 | 576.713 |
| -80.0 | 900.77 |
| -82.0 | 1167.005 |
| -82.0 | 1830.2 |
| -81.0 | 2224.143 |
| -76.0 | 2224.143 |
| -84.0 | 2258.832 |
| -79.0 | 2316.891 |
| -79.0 | 2320.501 |
| -78.0 | 2320.501 |
| -79.0 | 2320.745 |
| -80.0 | 2320.801 |
| -80.0 | 2320.801 |
| -80.0 | 2320.801 |
| -80.0 | 2320.801 |
| -80.0 | 2320.801 |
| -80.0 | 2320.801 |
| -80.0 | 2320.801 |
| -80.0 | 2320.801 |
| -80.0 | 2320.801 |
| -80.0 | 2320.801 |
| -80.0 | 2320.801 |
| -80.0 | 2320.801 |
| -80.0 | 2320.801 |
| -80.0 | 2320.801 |
| -80.0 | 2320.801 |
| -80.0 | 2320.801 |
| -80.0 | 2320.801 |
| -79.0 | 2320.801 |
| -79.0 | 2320.801 |
| -79.0 | 2320.801 |
| -79.0 | 2320.801 |
| -79.0 | 2320.801 |
| -79.0 | 2320.801 |
| -79.0 | 2320.801 |
| -79.0 | 2320.801 |
| -79.0 | 2320.801 |
| -79.0 | 2320.801 |
| -79.0 | 2320.801 |
| -79.0 | 2320.801 |
| -79.0 | 2320.801 |
| -79.0 | 2320.801 |
| -79.0 | 2320.801 |
| -79.0 | 2320.801 |
| -79.0 | 2320.801 |
| -79.0 | 2320.801 |
| -79.0 | 2320.801 |
| -79.0 | 2320.801 |
| -79.0 | 2320.801 |
| -79.0 | 2320.801 |
| -79.0 | 2320.801 |
| -79.0 | 2320.801 |
| -79.0 | 2320.801 |
| -79.0 | 2320.801 |
| -79.0 | 2320.801 |
| -79.0 | 2320.801 |
| -79.0 | 2320.801 |
| -79.0 | 2320.801 |
| -79.0 | 2320.801 |
| -79.0 | 2320.801 |
| -79.0 | 2320.801 |
| -79.0 | 2320.801 |
| -79.0 | 2320.801 |
| -79.0 | 2320.801 |
| -79.0 | 2320.801 |
| -79.0 | 2320.801 |
| -79.0 | 2320.801 |
| -79.0 | 2320.801 |
| -79.0 | 2320.801 |
| -79.0 | 2320.801 |
| -79.0 | 2320.801 |
| -79.0 | 2320.801 |
| -79.0 | 2320.801 |
| -79.0 | 2320.801 |
| -79.0 | 2320.801 |
| -79.0 | 2320.801 |
| -79.0 | 2320.801 |
| -79.0 | 2320.801 |
| -79.0 | 2320.801 |
| -79.0 | 2320.801 |
| -79.0 | 2320.801 |
| -79.0 | 2320.801 |
| -79.0 | 2320.801 |
| -79.0 | 2320.801 |
| -79.0 | 2320.801 |
| -79.0 | 2320.801 |
| -79.0 | 2320.801 |
| -78.0 | 2320.801 |
| -78.0 | 2320.801 |
| -78.0 | 2320.801 |
| -78.0 | 2320.801 |
| -78.0 | 2320.801 |
| -78.0 | 2320.801 |
| -78.0 | 2320.801 |
| -78.0 | 2320.801 |
| -78.0 | 2320.801 |
| -78.0 | 2320.801 |
| -78.0 | 2320.801 |
| -78.0 | 2320.801 |
| -78.0 | 2320.801 |
| -77.0 | 2320.801 |
| -77.0 | 2320.801 |
| -80.0 | 2320.858 |
| -80.0 | 2320.858 |
| -80.0 | 2320.858 |
| -80.0 | 2320.858 |
| -80.0 | 2320.858 |
| -80.0 | 2320.858 |
| -80.0 | 2320.858 |
| -79.0 | 2320.858 |
| -79.0 | 2320.858 |
| -79.0 | 2320.858 |
| -79.0 | 2320.858 |
| -79.0 | 2320.858 |
| -79.0 | 2320.858 |
| -79.0 | 2320.858 |
| -79.0 | 2320.858 |
| -79.0 | 2320.858 |
| -79.0 | 2320.858 |
| -79.0 | 2320.858 |
| -79.0 | 2320.858 |
| -79.0 | 2320.858 |
| -79.0 | 2320.858 |
| -79.0 | 2320.858 |
| -79.0 | 2320.858 |
| -79.0 | 2320.858 |
| -79.0 | 2320.858 |
| -79.0 | 2320.858 |
| -79.0 | 2320.858 |
| -79.0 | 2320.858 |
| -79.0 | 2320.858 |
| -79.0 | 2320.858 |
| -79.0 | 2320.858 |
| -79.0 | 2320.858 |
| -79.0 | 2320.858 |
| -79.0 | 2320.858 |
| -79.0 | 2320.858 |
| -79.0 | 2320.858 |
| -79.0 | 2320.858 |
| -79.0 | 2320.858 |
| -79.0 | 2320.858 |
| -79.0 | 2320.858 |
| -79.0 | 2320.858 |
| -79.0 | 2320.858 |
| -79.0 | 2320.858 |
| -79.0 | 2320.858 |
| -79.0 | 2320.858 |
| -79.0 | 2320.858 |
| -79.0 | 2320.858 |
| -79.0 | 2320.858 |
| -79.0 | 2320.858 |
| -79.0 | 2320.858 |
| -79.0 | 2320.858 |
| -79.0 | 2320.858 |
| -79.0 | 2320.858 |
| -79.0 | 2320.858 |
| -79.0 | 2320.858 |
| -79.0 | 2320.858 |
| -78.0 | 2320.858 |
| -78.0 | 2320.858 |
| -78.0 | 2320.858 |
| -78.0 | 2320.858 |
| -78.0 | 2320.858 |
| -78.0 | 2320.858 |
| -78.0 | 2320.858 |
| -78.0 | 2320.858 |
| -78.0 | 2320.858 |
| -78.0 | 2320.858 |
| -78.0 | 2320.858 |
| -78.0 | 2320.858 |
| -78.0 | 2320.858 |
| -78.0 | 2320.858 |
| -78.0 | 2320.858 |
| -78.0 | 2320.858 |
| -78.0 | 2320.858 |
| -78.0 | 2320.858 |
| -78.0 | 2320.858 |
| -78.0 | 2320.858 |
| -78.0 | 2320.858 |
| -78.0 | 2320.858 |
| -78.0 | 2320.858 |
| -78.0 | 2320.858 |
| -78.0 | 2320.858 |
| -78.0 | 2320.858 |
| -77.0 | 2320.858 |
| -77.0 | 2320.858 |
| -77.0 | 2320.858 |
| -77.0 | 2320.858 |
| -76.0 | 2320.858 |
| -81.0 | 2320.869 |
| -80.0 | 2320.869 |
| -81.0 | 2320.914 |
| -80.0 | 2320.914 |
| -80.0 | 2320.914 |
| -80.0 | 2320.914 |
| -80.0 | 2320.914 |
| -80.0 | 2320.914 |
| -80.0 | 2320.914 |
| -80.0 | 2320.914 |
| -80.0 | 2320.914 |
| -80.0 | 2320.914 |
| -80.0 | 2320.914 |
| -80.0 | 2320.914 |
| -79.0 | 2320.914 |
| -79.0 | 2320.914 |
| -79.0 | 2320.914 |
| -79.0 | 2320.914 |
| -79.0 | 2320.914 |
| -79.0 | 2320.914 |
| -79.0 | 2320.914 |
| -79.0 | 2320.914 |
| -79.0 | 2320.914 |
| -79.0 | 2320.914 |
| -79.0 | 2320.914 |
| -79.0 | 2320.914 |
| -79.0 | 2320.914 |
| -79.0 | 2320.914 |
| -79.0 | 2320.914 |
| -78.0 | 2320.914 |
| -78.0 | 2320.914 |
| -77.0 | 2320.914 |
| -79.0 | 2320.971 |
| -79.0 | 2320.971 |
| -78.0 | 2320.971 |
| -84.0 | 2322.032 |
| -83.0 | 2322.154 |
| -82.0 | 2322.322 |
| -82.0 | 2322.614 |
| -82.0 | 2323.191 |
| -83.0 | 2323.916 |
| -81.0 | 2347.009 |
| -81.0 | 4663.06 |